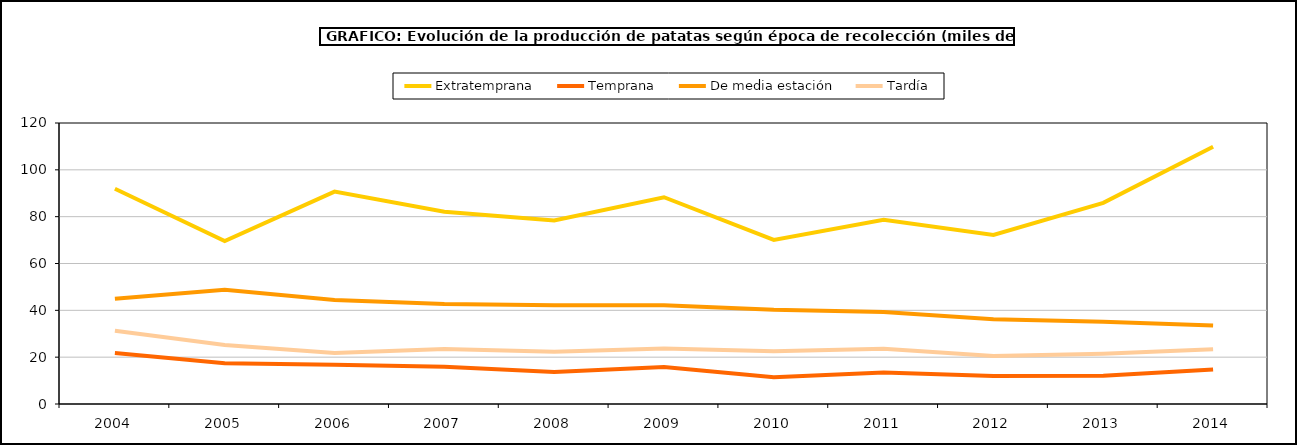
| Category | Extratemprana | Temprana | De media estación | Tardía |
|---|---|---|---|---|
| 2004.0 | 91.946 | 21.783 | 44.931 | 31.244 |
| 2005.0 | 69.624 | 17.435 | 48.734 | 25.155 |
| 2006.0 | 90.691 | 16.814 | 44.395 | 21.83 |
| 2007.0 | 82.104 | 15.925 | 42.735 | 23.526 |
| 2008.0 | 78.383 | 13.629 | 42.134 | 22.278 |
| 2009.0 | 88.296 | 15.804 | 42.188 | 23.661 |
| 2010.0 | 70.07 | 11.444 | 40.198 | 22.492 |
| 2011.0 | 78.631 | 13.439 | 39.332 | 23.623 |
| 2012.0 | 72.219 | 12.004 | 36.224 | 20.486 |
| 2013.0 | 85.916 | 12.091 | 35.096 | 21.424 |
| 2014.0 | 109.861 | 14.725 | 33.547 | 23.388 |